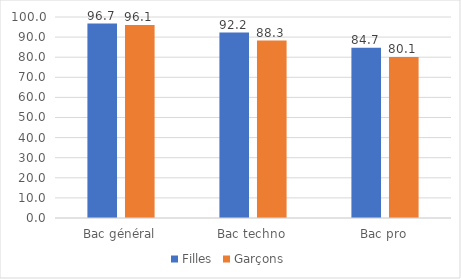
| Category | Filles | Garçons |
|---|---|---|
| Bac général | 96.743 | 96.067 |
| Bac techno | 92.232 | 88.26 |
| Bac pro | 84.716 | 80.072 |